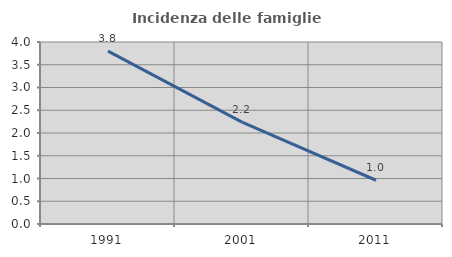
| Category | Incidenza delle famiglie numerose |
|---|---|
| 1991.0 | 3.799 |
| 2001.0 | 2.241 |
| 2011.0 | 0.962 |